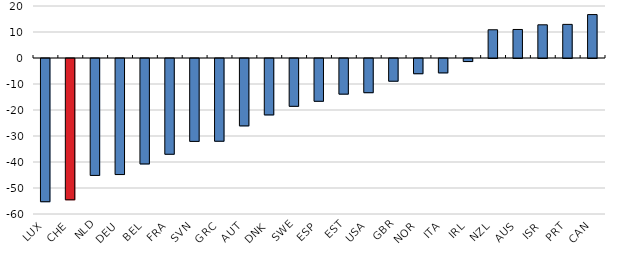
| Category | Series 0 |
|---|---|
| LUX | -55.081 |
| CHE | -54.348 |
| NLD | -44.967 |
| DEU | -44.635 |
| BEL | -40.547 |
| FRA | -36.829 |
| SVN | -31.884 |
| GRC | -31.825 |
| AUT | -25.916 |
| DNK | -21.7 |
| SWE | -18.394 |
| ESP | -16.455 |
| EST | -13.704 |
| USA | -13.151 |
| GBR | -8.738 |
| NOR | -5.857 |
| ITA | -5.532 |
| IRL | -1.17 |
| NZL | 10.858 |
| AUS | 10.97 |
| ISR | 12.77 |
| PRT | 12.927 |
| CAN | 16.704 |